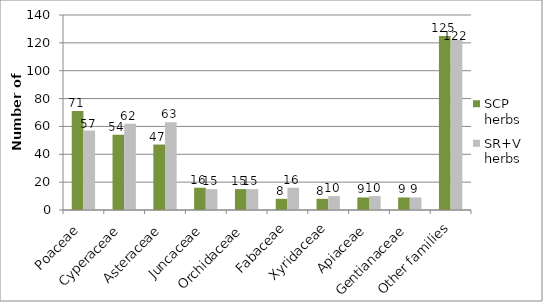
| Category | SCP herbs | SR+V herbs |
|---|---|---|
| Poaceae | 71 | 57 |
| Cyperaceae | 54 | 62 |
| Asteraceae | 47 | 63 |
| Juncaceae | 16 | 15 |
| Orchidaceae | 15 | 15 |
| Fabaceae | 8 | 16 |
| Xyridaceae | 8 | 10 |
| Apiaceae | 9 | 10 |
| Gentianaceae | 9 | 9 |
| Other families | 125 | 122 |